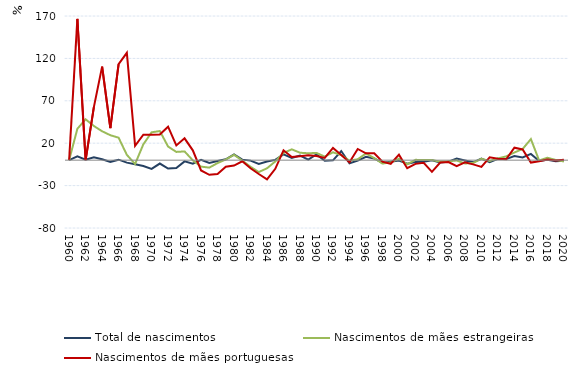
| Category | Total de nascimentos | Nascimentos de mães estrangeiras | Nascimentos de mães portuguesas |
|---|---|---|---|
| 1960.0 | 0 | 0 | 0 |
| 1961.0 | 4.548 | 36.991 | 166.667 |
| 1962.0 | 0.579 | 48.184 | 0 |
| 1963.0 | 3.492 | 40.294 | 62.5 |
| 1964.0 | 1.073 | 34.085 | 110.256 |
| 1965.0 | -1.981 | 29.421 | 37.805 |
| 1966.0 | 0.576 | 26.484 | 113.274 |
| 1967.0 | -2.941 | 6.259 | 126.556 |
| 1968.0 | -4.869 | -4.52 | 16.85 |
| 1969.0 | -6.843 | 18.677 | 29.937 |
| 1970.0 | -10.255 | 32.823 | 30.036 |
| 1971.0 | -3.981 | 34.341 | 30.241 |
| 1972.0 | -9.931 | 16.075 | 39.459 |
| 1973.0 | -9.352 | 9.71 | 17.416 |
| 1974.0 | -1.457 | 10.313 | 25.75 |
| 1975.0 | -4.129 | -0.206 | 11.588 |
| 1976.0 | 0.39 | -7.586 | -12.12 |
| 1977.0 | -3.402 | -8.814 | -17.249 |
| 1978.0 | -1.009 | -3.424 | -16.283 |
| 1979.0 | 0.957 | 0.802 | -7.739 |
| 1980.0 | 6.645 | 6.336 | -6.402 |
| 1981.0 | 0.628 | -0.522 | -1.356 |
| 1982.0 | -0.542 | -7.802 | -9.564 |
| 1983.0 | -4.346 | -14.03 | -16.325 |
| 1984.0 | -1.686 | -9.587 | -22.591 |
| 1985.0 | 0.342 | -1.534 | -10.204 |
| 1986.0 | 6.791 | 8.472 | 11.705 |
| 1987.0 | 2.564 | 12.767 | 3.764 |
| 1988.0 | 5.49 | 8.77 | 4.608 |
| 1989.0 | 0.632 | 8.119 | 5.904 |
| 1990.0 | 6.7 | 8.529 | 4.779 |
| 1991.0 | -0.681 | 4.169 | 2.618 |
| 1992.0 | -0.202 | 9.267 | 14.403 |
| 1993.0 | 10.773 | 5.993 | 6.115 |
| 1994.0 | -3.613 | -0.595 | -2.508 |
| 1995.0 | -0.569 | 1.057 | 13.213 |
| 1996.0 | 4.024 | 7.892 | 8.108 |
| 1997.0 | 2.03 | 2.398 | 8.125 |
| 1998.0 | -3.342 | -4.034 | -1.734 |
| 1999.0 | -1.82 | -2.57 | -4.278 |
| 2000.0 | -0.486 | 1.772 | 6.48 |
| 2001.0 | -4.24 | -4.899 | -9.496 |
| 2002.0 | -2.073 | 0.346 | -4.348 |
| 2003.0 | -1.742 | 0.281 | -3.091 |
| 2004.0 | -0.156 | 0.072 | -13.759 |
| 2005.0 | -2.81 | -1.743 | -2.756 |
| 2006.0 | -1.906 | -1.357 | -2.163 |
| 2007.0 | 1.804 | -0.394 | -7.165 |
| 2008.0 | -0.343 | -3.951 | -2.545 |
| 2009.0 | -2.548 | -3.273 | -4.971 |
| 2010.0 | 1.928 | 1.624 | -7.979 |
| 2011.0 | -2.251 | -0.989 | 3.372 |
| 2012.0 | 1.639 | 2.14 | 1.771 |
| 2013.0 | 1.266 | 4.395 | 1.007 |
| 2014.0 | 4.817 | 9.031 | 14.687 |
| 2015.0 | 3.168 | 13.228 | 12.569 |
| 2016.0 | 7.397 | 24.851 | -2.879 |
| 2017.0 | -0.915 | -0.421 | -1.374 |
| 2018.0 | 0.336 | 2.869 | 0.733 |
| 2019.0 | -1.198 | 0.28 | -0.291 |
| 2020.0 | -0.636 | -1.564 | 0.584 |